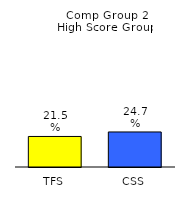
| Category | Series 0 |
|---|---|
| TFS | 0.215 |
| CSS | 0.247 |